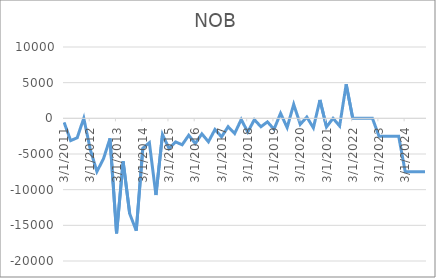
| Category | NOB | GDP |
|---|---|---|
| 3/31/11 | -567 |  |
| 6/30/11 | -3124 |  |
| 9/30/11 | -2723 |  |
| 12/31/11 | 12 |  |
| 3/31/12 | -4388 |  |
| 6/30/12 | -7464 |  |
| 9/30/12 | -5678 |  |
| 12/31/12 | -2815 |  |
| 3/31/13 | -16118 |  |
| 6/30/13 | -6039 |  |
| 9/30/13 | -13369 |  |
| 12/31/13 | -15748 |  |
| 3/31/14 | -4189 |  |
| 6/30/14 | -3417 |  |
| 9/30/14 | -10744 |  |
| 12/31/14 | -2284 |  |
| 3/31/15 | -4242 |  |
| 6/30/15 | -3308 |  |
| 9/30/15 | -3709 |  |
| 12/31/15 | -2371 |  |
| 3/31/16 | -3537 |  |
| 6/30/16 | -2178 |  |
| 9/30/16 | -3286 |  |
| 12/31/16 | -1562 |  |
| 3/31/17 | -2603 |  |
| 6/30/17 | -1174 |  |
| 9/30/17 | -2127 |  |
| 12/31/17 | -159 |  |
| 3/31/18 | -1922 |  |
| 6/30/18 | -181 |  |
| 9/30/18 | -1178 |  |
| 12/31/18 | -498 |  |
| 3/31/19 | -1533 |  |
| 6/30/19 | 705 |  |
| 9/30/19 | -1298 |  |
| 12/31/19 | 1962 |  |
| 3/31/20 | -841 |  |
| 6/30/20 | 177 |  |
| 9/30/20 | -1333 |  |
| 12/31/20 | 2578 |  |
| 3/31/21 | -1205 |  |
| 6/30/21 | 0 |  |
| 9/30/21 | -1076 |  |
| 12/31/21 | 4768 |  |
| 3/31/22 | 0 |  |
| 6/30/22 | 0 |  |
| 9/30/22 | 0 |  |
| 12/31/22 | 0 |  |
| 3/31/23 | -2500 |  |
| 6/30/23 | -2500 |  |
| 9/30/23 | -2500 |  |
| 12/31/23 | -2500 |  |
| 3/31/24 | -7500 |  |
| 6/30/24 | -7500 |  |
| 9/30/24 | -7500 |  |
| 12/31/24 | -7500 |  |